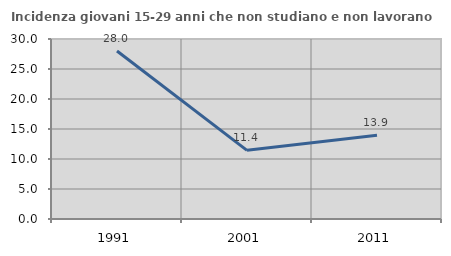
| Category | Incidenza giovani 15-29 anni che non studiano e non lavorano  |
|---|---|
| 1991.0 | 28 |
| 2001.0 | 11.444 |
| 2011.0 | 13.949 |